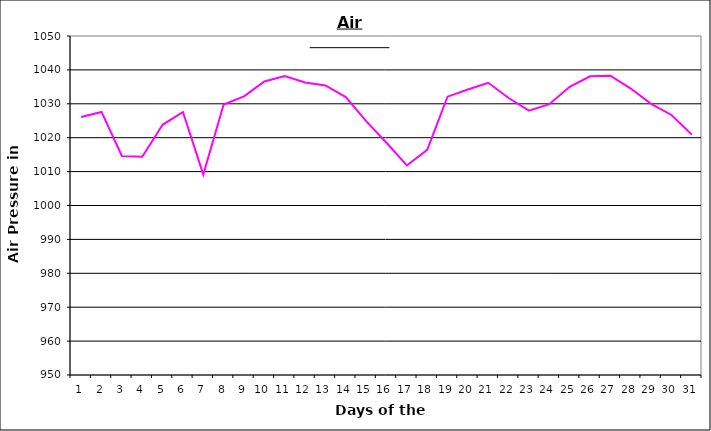
| Category | Series 0 |
|---|---|
| 0 | 1026.1 |
| 1 | 1027.6 |
| 2 | 1014.6 |
| 3 | 1014.4 |
| 4 | 1023.8 |
| 5 | 1027.6 |
| 6 | 1009.1 |
| 7 | 1029.8 |
| 8 | 1032.2 |
| 9 | 1036.6 |
| 10 | 1038.2 |
| 11 | 1036.3 |
| 12 | 1035.4 |
| 13 | 1032 |
| 14 | 1024.9 |
| 15 | 1018.5 |
| 16 | 1011.8 |
| 17 | 1016.4 |
| 18 | 1032.1 |
| 19 | 1034.2 |
| 20 | 1036.2 |
| 21 | 1031.7 |
| 22 | 1028 |
| 23 | 1029.9 |
| 24 | 1035 |
| 25 | 1038.1 |
| 26 | 1038.3 |
| 27 | 1034.5 |
| 28 | 1030 |
| 29 | 1026.7 |
| 30 | 1020.9 |